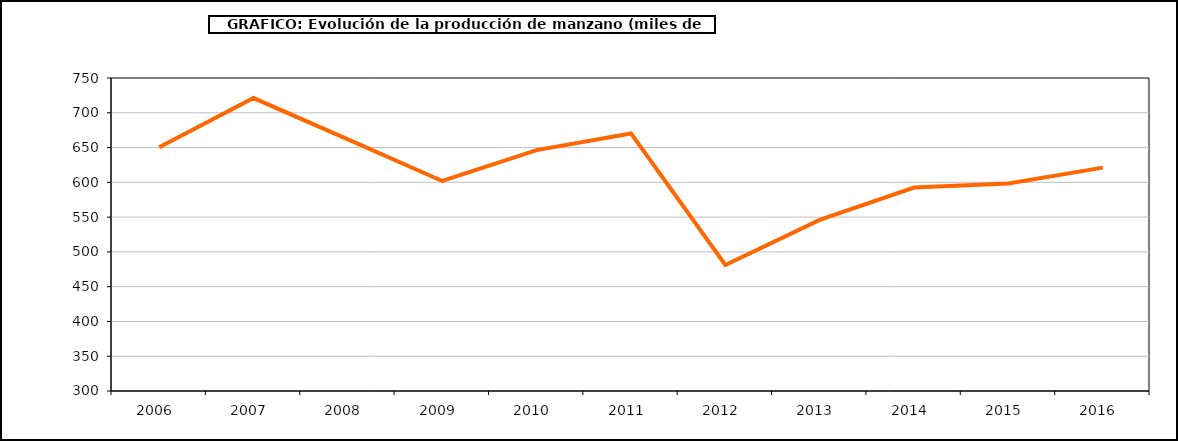
| Category | producción manzano |
|---|---|
| 2006.0 | 650.384 |
| 2007.0 | 721.178 |
| 2008.0 | 661.724 |
| 2009.0 | 601.979 |
| 2010.0 | 646.264 |
| 2011.0 | 670.284 |
| 2012.0 | 481.223 |
| 2013.0 | 545.992 |
| 2014.0 | 592.576 |
| 2015.0 | 598.207 |
| 2016.0 | 621.164 |